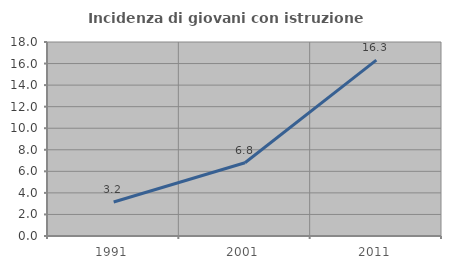
| Category | Incidenza di giovani con istruzione universitaria |
|---|---|
| 1991.0 | 3.153 |
| 2001.0 | 6.801 |
| 2011.0 | 16.321 |